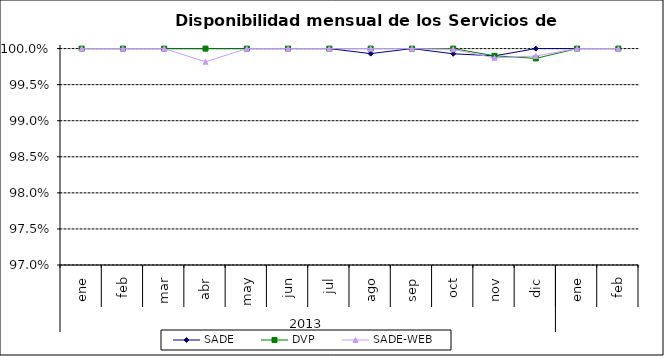
| Category | SADE | DVP | SADE-WEB |
|---|---|---|---|
| 0 | 1 | 1 | 1 |
| 1 | 1 | 1 | 1 |
| 2 | 1 | 1 | 1 |
| 3 | 1 | 1 | 0.998 |
| 4 | 1 | 1 | 1 |
| 5 | 1 | 1 | 1 |
| 6 | 1 | 1 | 1 |
| 7 | 0.999 | 1 | 1 |
| 8 | 1 | 1 | 1 |
| 9 | 0.999 | 1 | 1 |
| 10 | 0.999 | 0.999 | 0.999 |
| 11 | 1 | 0.999 | 0.999 |
| 12 | 1 | 1 | 1 |
| 13 | 1 | 1 | 1 |